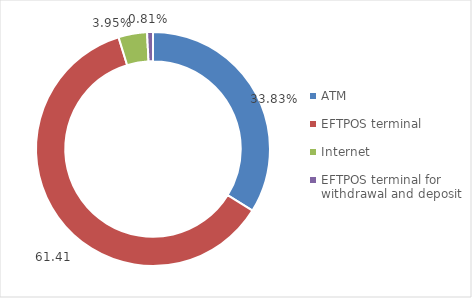
| Category | Series 0 |
|---|---|
| ATM | 11201794198 |
| EFTPOS terminal | 20337662262 |
| Internet | 1307339242 |
| EFTPOS terminal for withdrawal and deposit | 267880579 |